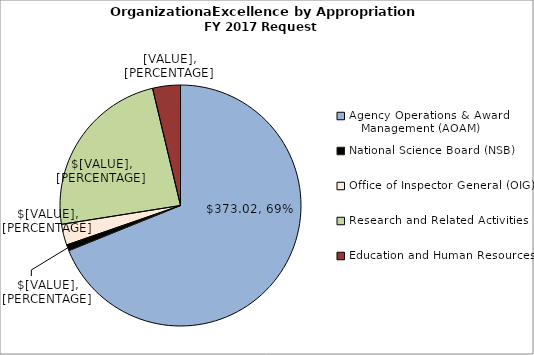
| Category | Series 0 |
|---|---|
| Agency Operations & Award
   Management (AOAM) | 373.02 |
| National Science Board (NSB) | 4.38 |
| Office of Inspector General (OIG) | 15.2 |
| Research and Related Activities | 128.75 |
| Education and Human Resources | 20.18 |